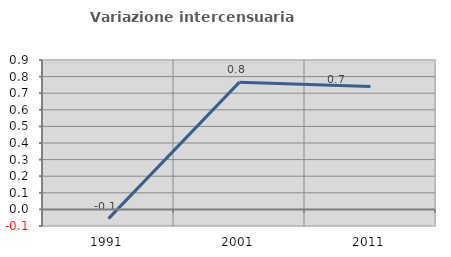
| Category | Variazione intercensuaria annua |
|---|---|
| 1991.0 | -0.056 |
| 2001.0 | 0.767 |
| 2011.0 | 0.741 |